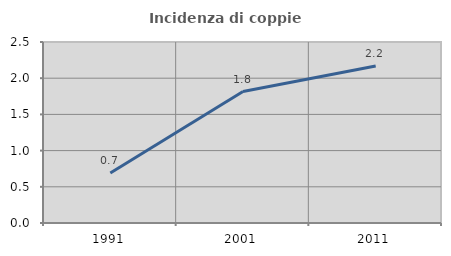
| Category | Incidenza di coppie miste |
|---|---|
| 1991.0 | 0.691 |
| 2001.0 | 1.816 |
| 2011.0 | 2.169 |